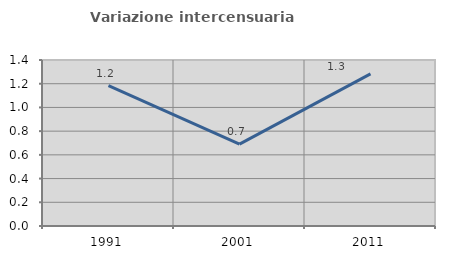
| Category | Variazione intercensuaria annua |
|---|---|
| 1991.0 | 1.184 |
| 2001.0 | 0.691 |
| 2011.0 | 1.283 |